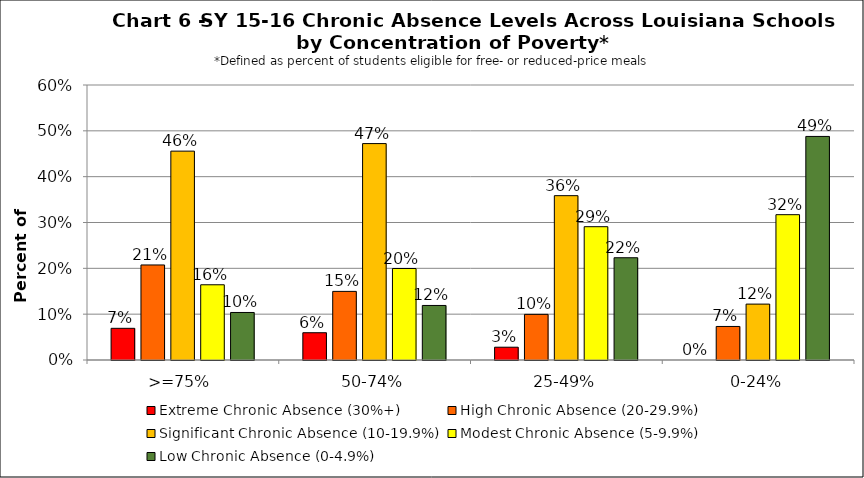
| Category | Extreme Chronic Absence (30%+) | High Chronic Absence (20-29.9%) | Significant Chronic Absence (10-19.9%) | Modest Chronic Absence (5-9.9%) | Low Chronic Absence (0-4.9%) |
|---|---|---|---|---|---|
| 0 | 0.069 | 0.207 | 0.456 | 0.164 | 0.104 |
| 1 | 0.06 | 0.15 | 0.472 | 0.2 | 0.119 |
| 2 | 0.028 | 0.1 | 0.359 | 0.291 | 0.223 |
| 3 | 0 | 0.073 | 0.122 | 0.317 | 0.488 |